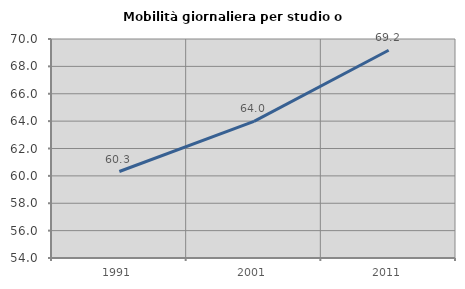
| Category | Mobilità giornaliera per studio o lavoro |
|---|---|
| 1991.0 | 60.319 |
| 2001.0 | 63.987 |
| 2011.0 | 69.177 |